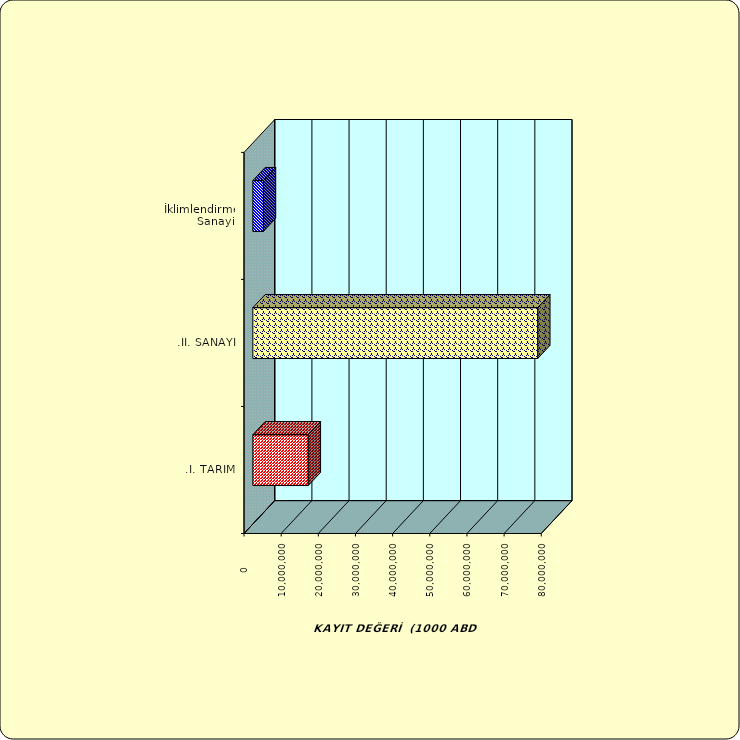
| Category | Series 0 |
|---|---|
| .I. TARIM | 14915739.739 |
| .II. SANAYİ | 76668148.374 |
|  İklimlendirme Sanayii | 2841727.109 |